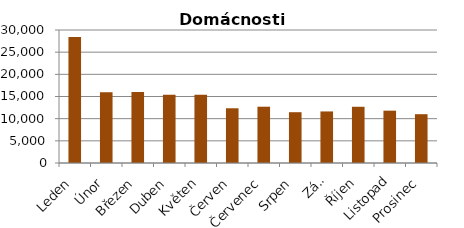
| Category | DOM |
|---|---|
| Leden | 28400 |
| Únor | 15936 |
| Březen | 16043 |
| Duben | 15388 |
| Květen | 15392 |
| Červen | 12342 |
| Červenec | 12698 |
| Srpen | 11457 |
| Září | 11629 |
| Říjen | 12682 |
| Listopad | 11806 |
| Prosinec | 11010 |